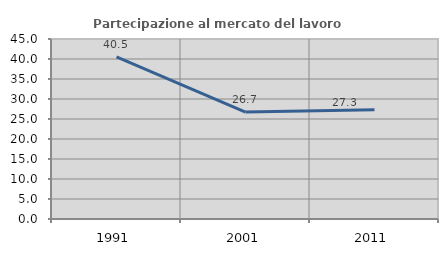
| Category | Partecipazione al mercato del lavoro  femminile |
|---|---|
| 1991.0 | 40.523 |
| 2001.0 | 26.724 |
| 2011.0 | 27.318 |